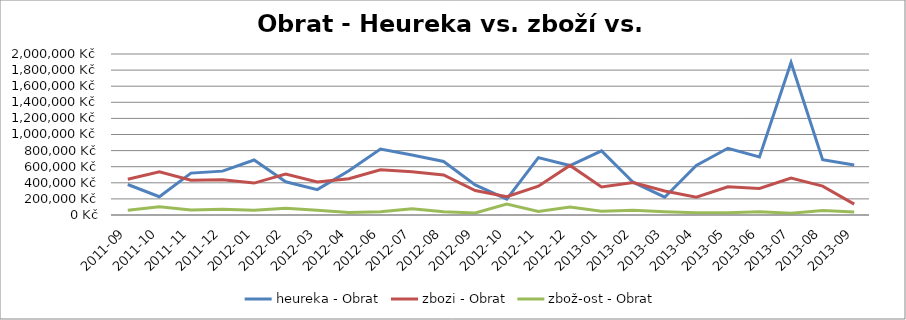
| Category | heureka - Obrat | zbozi - Obrat | zbož-ost - Obrat |
|---|---|---|---|
| 2011-09 | 378611.982 | 444515.751 | 59722.868 |
| 2011-10 | 226583.848 | 537312.268 | 101676.435 |
| 2011-11 | 520242.682 | 431761.278 | 63639.07 |
| 2011-12 | 544848.476 | 437141.528 | 71748.724 |
| 2012-01 | 682902.794 | 396359.627 | 57722.259 |
| 2012-02 | 413064.624 | 507384.494 | 82600.001 |
| 2012-03 | 315504.414 | 410395.806 | 58140.783 |
| 2012-04 | 549437.055 | 450682.182 | 31499.621 |
| 2012-06 | 820183.48 | 560643.015 | 39608.6 |
| 2012-07 | 746437.422 | 538613.856 | 76141.18 |
| 2012-08 | 665202.093 | 496963.629 | 39071.024 |
| 2012-09 | 374214.626 | 304665.288 | 24632.858 |
| 2012-10 | 196608.653 | 227514.624 | 137361.384 |
| 2012-11 | 712291.666 | 357754.76 | 44653.446 |
| 2012-12 | 614179.308 | 615819.164 | 98797.193 |
| 2013-01 | 797101.091 | 347417.389 | 47904.343 |
| 2013-02 | 407297.564 | 402503.556 | 59219.398 |
| 2013-03 | 221121.976 | 297535.715 | 39342.261 |
| 2013-04 | 616390.401 | 222064.489 | 27227.52 |
| 2013-05 | 829202.232 | 350606.719 | 26516.674 |
| 2013-06 | 720432.193 | 329543.394 | 39611.596 |
| 2013-07 | 1895297.232 | 457862.389 | 21125.671 |
| 2013-08 | 686287.651 | 359016.811 | 54726.659 |
| 2013-09 | 621330.078 | 134558.797 | 35891.59 |